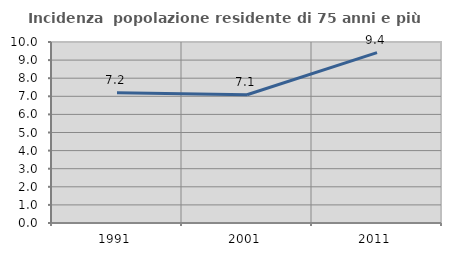
| Category | Incidenza  popolazione residente di 75 anni e più |
|---|---|
| 1991.0 | 7.192 |
| 2001.0 | 7.083 |
| 2011.0 | 9.411 |